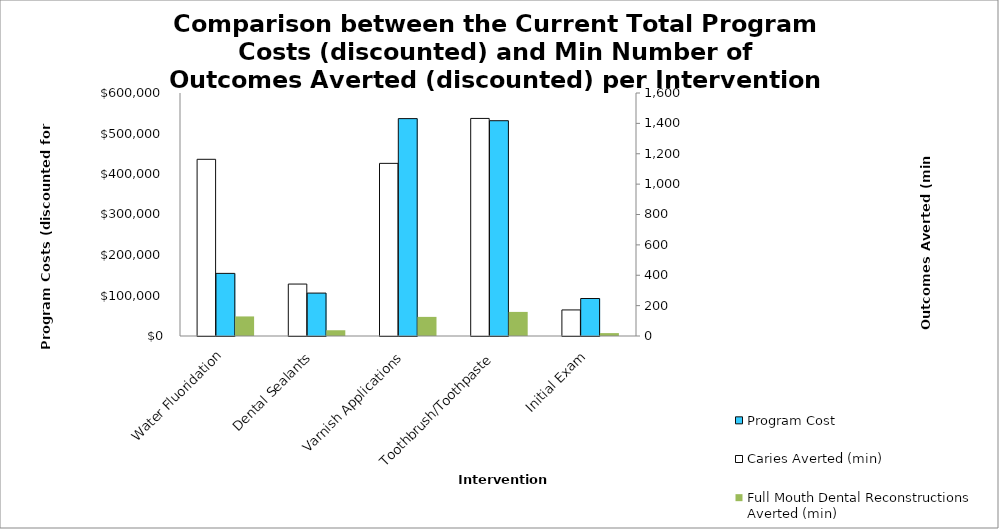
| Category | Program Cost |
|---|---|
| Water Fluoridation | 154609.926 |
| Dental Sealants | 105945.119 |
| Varnish Applications | 536747.275 |
| Toothbrush/Toothpaste | 531559.59 |
| Initial Exam | 92559.184 |